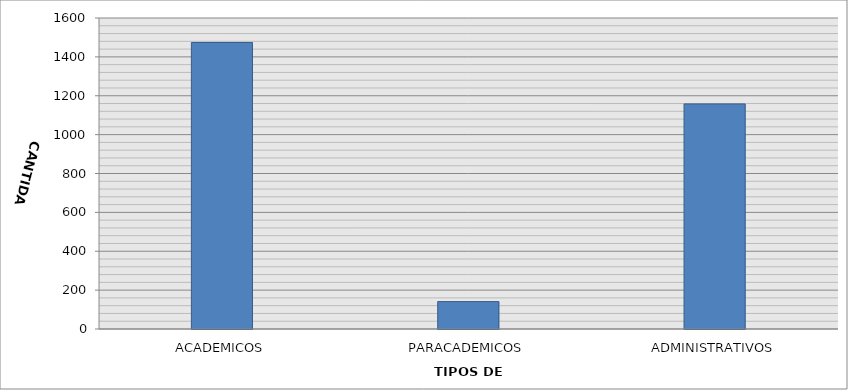
| Category | CANTIDAD |
|---|---|
| ACADEMICOS | 1474 |
| PARACADEMICOS | 141 |
| ADMINISTRATIVOS | 1158 |